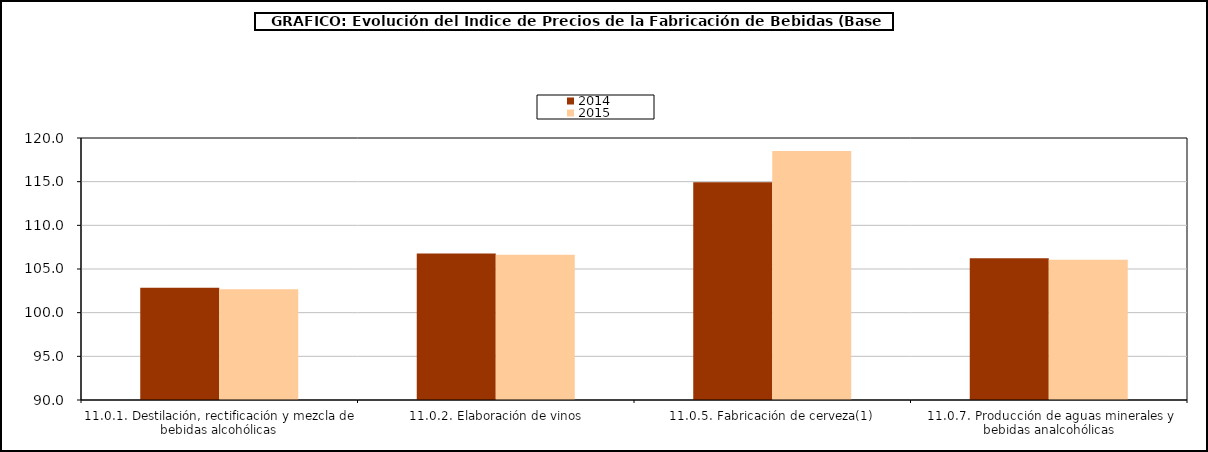
| Category | 2014 | 2015 |
|---|---|---|
| 11.0.1. Destilación, rectificación y mezcla de bebidas alcohólicas | 102.864 | 102.676 |
| 11.0.2. Elaboración de vinos | 106.768 | 106.638 |
| 11.0.5. Fabricación de cerveza(1) | 114.943 | 118.508 |
| 11.0.7. Producción de aguas minerales y bebidas analcohólicas | 106.238 | 106.07 |